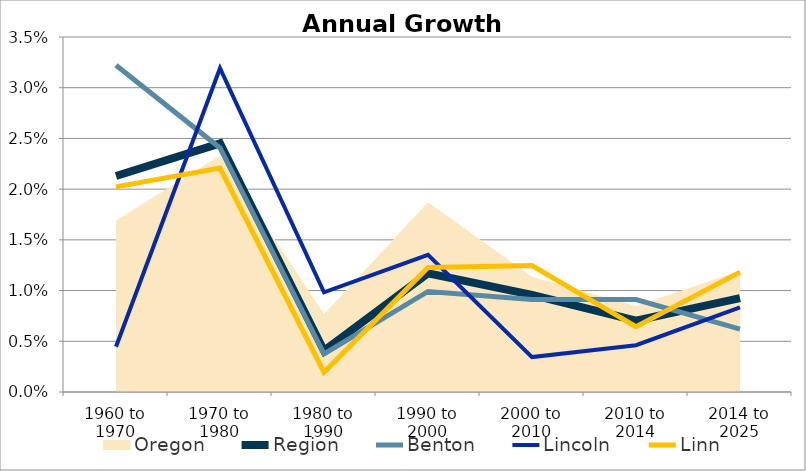
| Category | Region | Benton | Lincoln | Linn  |
|---|---|---|---|---|
| 1960 to 1970 | 0.021 | 0.032 | 0.004 | 0.02 |
| 1970 to 1980 | 0.025 | 0.024 | 0.032 | 0.022 |
| 1980 to 1990 | 0.004 | 0.004 | 0.01 | 0.002 |
| 1990 to 2000 | 0.012 | 0.01 | 0.014 | 0.012 |
| 2000 to 2010 | 0.01 | 0.009 | 0.003 | 0.012 |
| 2010 to 2014 | 0.007 | 0.009 | 0.005 | 0.006 |
| 2014 to 2025 | 0.009 | 0.006 | 0.008 | 0.012 |